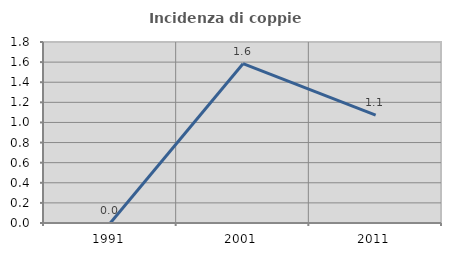
| Category | Incidenza di coppie miste |
|---|---|
| 1991.0 | 0 |
| 2001.0 | 1.584 |
| 2011.0 | 1.073 |